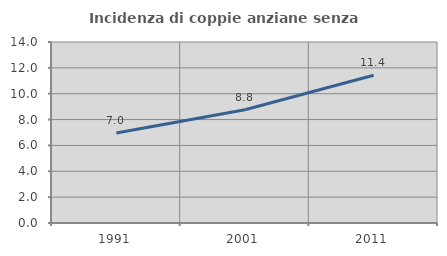
| Category | Incidenza di coppie anziane senza figli  |
|---|---|
| 1991.0 | 6.966 |
| 2001.0 | 8.755 |
| 2011.0 | 11.434 |